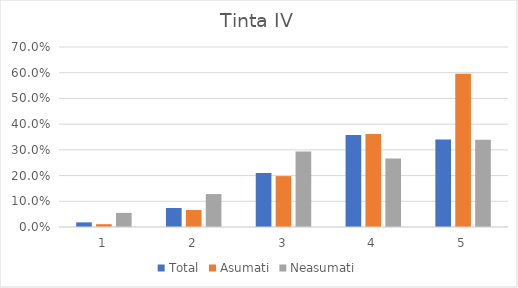
| Category | Total | Asumati | Neasumati |
|---|---|---|---|
| 0 | 0.018 | 0.011 | 0.055 |
| 1 | 0.074 | 0.066 | 0.128 |
| 2 | 0.21 | 0.198 | 0.294 |
| 3 | 0.358 | 0.362 | 0.266 |
| 4 | 0.34 | 0.596 | 0.339 |